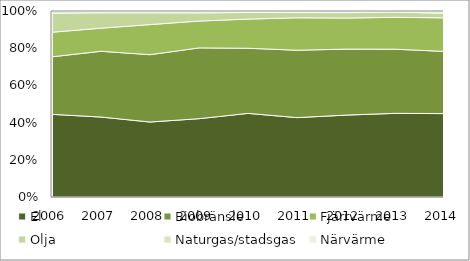
| Category | El | Biobränsle | Fjärrvärme | Olja | Naturgas/stadsgas | Närvärme |
|---|---|---|---|---|---|---|
| 2006.0 | 0.447 | 0.311 | 0.133 | 0.103 | 0.009 | 0.003 |
| 2007.0 | 0.43 | 0.354 | 0.124 | 0.083 | 0.006 | 0.003 |
| 2008.0 | 0.403 | 0.362 | 0.162 | 0.063 | 0.006 | 0.003 |
| 2009.0 | 0.421 | 0.381 | 0.144 | 0.044 | 0.006 | 0.004 |
| 2010.0 | 0.45 | 0.35 | 0.157 | 0.036 | 0.006 | 0.002 |
| 2011.0 | 0.427 | 0.362 | 0.174 | 0.028 | 0.004 | 0.005 |
| 2012.0 | 0.44 | 0.355 | 0.167 | 0.029 | 0.005 | 0.004 |
| 2013.0 | 0.45 | 0.345 | 0.172 | 0.028 | 0.003 | 0.003 |
| 2014.0 | 0.448 | 0.335 | 0.18 | 0.024 | 0.008 | 0.005 |